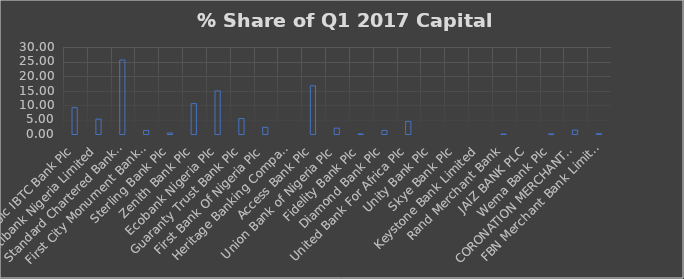
| Category | % Share |
|---|---|
| Stanbic IBTC Bank Plc | 9.116 |
| Citibank Nigeria Limited | 5.121 |
| Standard Chartered Bank Nigeria Limited | 25.492 |
| First City Monument Bank Plc | 1.232 |
| Sterling Bank Plc | 0.336 |
| Zenith Bank Plc | 10.477 |
| Ecobank Nigeria Plc | 14.869 |
| Guaranty Trust Bank Plc | 5.325 |
| First Bank Of Nigeria Plc | 2.293 |
| Heritage Banking Company Limited | 0 |
| Access Bank Plc | 16.617 |
| Union Bank of Nigeria Plc | 2.022 |
| Fidelity Bank Plc | 0.033 |
| Diamond Bank Plc | 1.225 |
| United Bank For Africa Plc | 4.33 |
| Unity Bank Plc | 0 |
| Skye Bank Plc | 0 |
| Keystone Bank Limited | 0 |
| Rand Merchant Bank | 0.008 |
| JAIZ BANK PLC | 0 |
| Wema Bank Plc | 0.051 |
| CORONATION MERCHANT BANK | 1.343 |
| FBN Merchant Bank Limited | 0.11 |